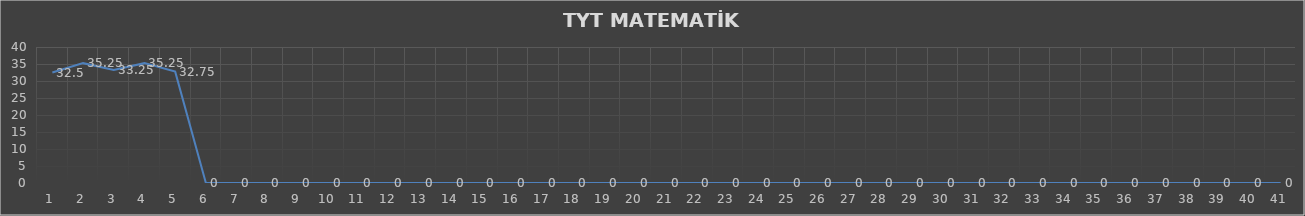
| Category | Series 0 |
|---|---|
| 0 | 32.5 |
| 1 | 35.25 |
| 2 | 33.25 |
| 3 | 35.25 |
| 4 | 32.75 |
| 5 | 0 |
| 6 | 0 |
| 7 | 0 |
| 8 | 0 |
| 9 | 0 |
| 10 | 0 |
| 11 | 0 |
| 12 | 0 |
| 13 | 0 |
| 14 | 0 |
| 15 | 0 |
| 16 | 0 |
| 17 | 0 |
| 18 | 0 |
| 19 | 0 |
| 20 | 0 |
| 21 | 0 |
| 22 | 0 |
| 23 | 0 |
| 24 | 0 |
| 25 | 0 |
| 26 | 0 |
| 27 | 0 |
| 28 | 0 |
| 29 | 0 |
| 30 | 0 |
| 31 | 0 |
| 32 | 0 |
| 33 | 0 |
| 34 | 0 |
| 35 | 0 |
| 36 | 0 |
| 37 | 0 |
| 38 | 0 |
| 39 | 0 |
| 40 | 0 |